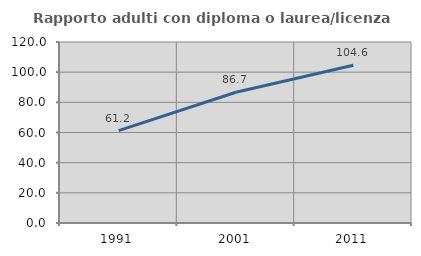
| Category | Rapporto adulti con diploma o laurea/licenza media  |
|---|---|
| 1991.0 | 61.238 |
| 2001.0 | 86.653 |
| 2011.0 | 104.579 |